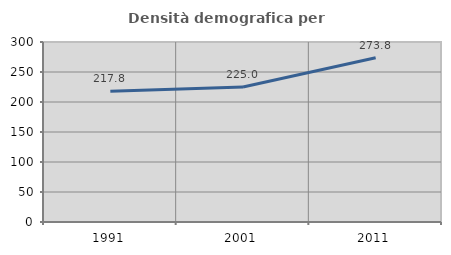
| Category | Densità demografica |
|---|---|
| 1991.0 | 217.845 |
| 2001.0 | 225.029 |
| 2011.0 | 273.816 |